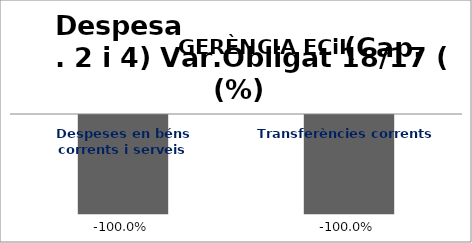
| Category | Series 0 |
|---|---|
| Despeses en béns corrents i serveis | -1 |
| Transferències corrents | -1 |